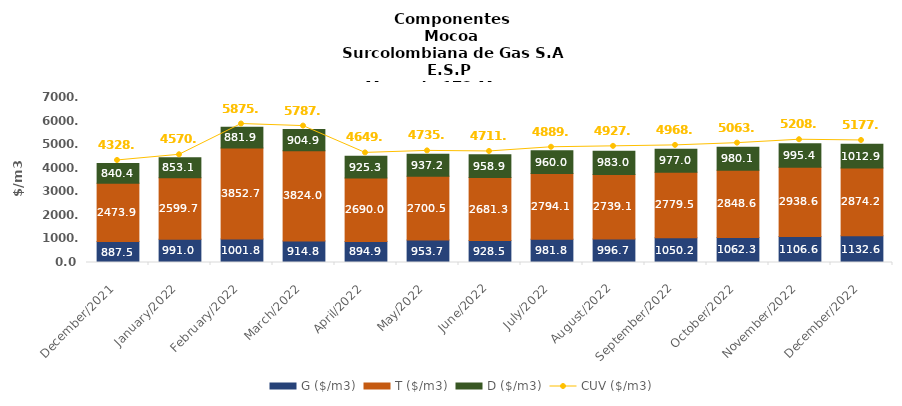
| Category | G ($/m3) | T ($/m3) | D ($/m3) |
|---|---|---|---|
| 2021-12-01 | 887.54 | 2473.88 | 840.42 |
| 2022-01-01 | 990.98 | 2599.65 | 853.11 |
| 2022-02-01 | 1001.77 | 3852.68 | 881.93 |
| 2022-03-01 | 914.81 | 3823.95 | 904.86 |
| 2022-04-01 | 894.94 | 2689.95 | 925.27 |
| 2022-05-01 | 953.73 | 2700.46 | 937.18 |
| 2022-06-01 | 928.46 | 2681.27 | 958.88 |
| 2022-07-01 | 981.79 | 2794.1 | 959.99 |
| 2022-08-01 | 996.74 | 2739.11 | 983.01 |
| 2022-09-01 | 1050.2 | 2779.53 | 976.98 |
| 2022-10-01 | 1062.28 | 2848.55 | 980.12 |
| 2022-11-01 | 1106.58 | 2938.59 | 995.43 |
| 2022-12-01 | 1132.64 | 2874.17 | 1012.88 |